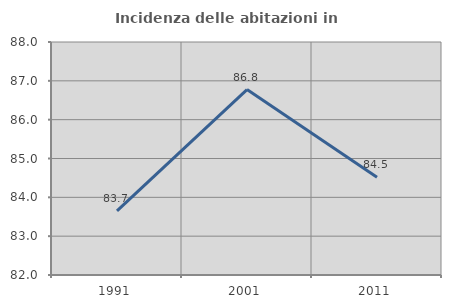
| Category | Incidenza delle abitazioni in proprietà  |
|---|---|
| 1991.0 | 83.65 |
| 2001.0 | 86.775 |
| 2011.0 | 84.517 |